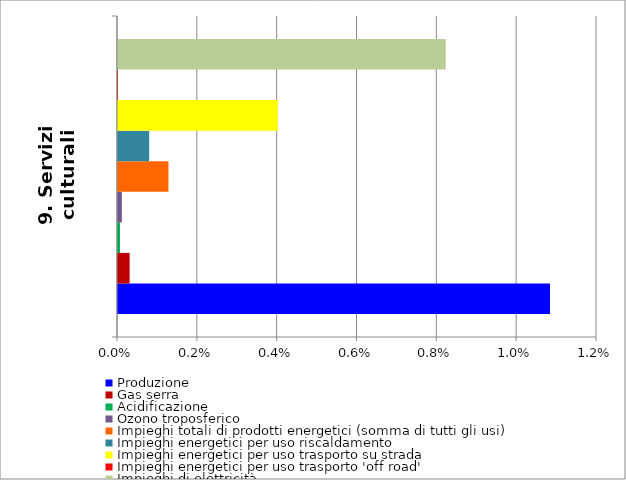
| Category | Produzione | Gas serra | Acidificazione | Ozono troposferico | Impieghi totali di prodotti energetici (somma di tutti gli usi) | Impieghi energetici per uso riscaldamento | Impieghi energetici per uso trasporto su strada | Impieghi energetici per uso trasporto 'off road' | Impieghi di elettricità |
|---|---|---|---|---|---|---|---|---|---|
| 9. Servizi culturali | 0.011 | 0 | 0 | 0 | 0.001 | 0.001 | 0.004 | 0 | 0.008 |